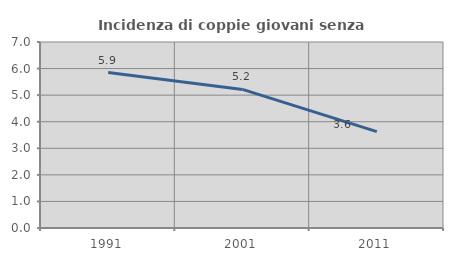
| Category | Incidenza di coppie giovani senza figli |
|---|---|
| 1991.0 | 5.852 |
| 2001.0 | 5.215 |
| 2011.0 | 3.628 |